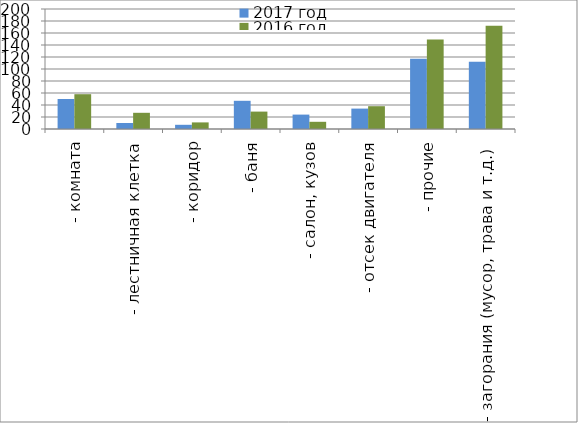
| Category | 2017 год | 2016 год |
|---|---|---|
|  - комната | 50 | 58 |
|  - лестничная клетка | 10 | 27 |
|  - коридор | 7 | 11 |
|  - баня | 47 | 29 |
|  - салон, кузов | 24 | 12 |
|  - отсек двигателя | 34 | 38 |
| - прочие | 117 | 149 |
| - загорания (мусор, трава и т.д.)  | 112 | 172 |